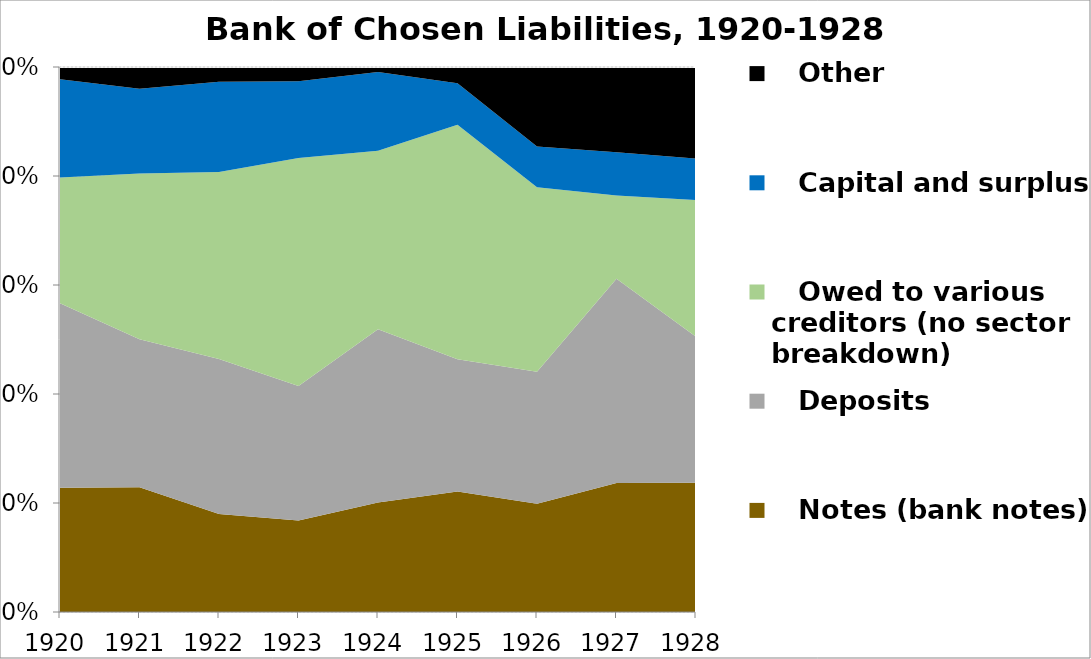
| Category |    Notes (bank notes) |    Deposits |    Owed to various creditors (no sector breakdown) |    Capital and surplus |    Other |
|---|---|---|---|---|---|
| 1920.0 | 115612165 | 171734853 | 116905742 | 91279018 | 11506372 |
| 1921.0 | 137611559 | 162947962 | 182703163 | 93553252 | 23885809 |
| 1922.0 | 101658245 | 160557157 | 193971273 | 93575055 | 15239740 |
| 1923.0 | 110750511 | 163149391 | 276108561 | 92834530 | 17364085 |
| 1924.0 | 129564325 | 204623572 | 211027225 | 93181661 | 5828740 |
| 1925.0 | 120898098 | 132736546 | 235456751 | 41627336 | 16289780 |
| 1926.0 | 111278652 | 135870754 | 189816655 | 41781950 | 81763078 |
| 1927.0 | 124863873 | 197712705 | 80353829 | 42015048 | 82450491 |
| 1928.0 | 132778502 | 149919045 | 140496963 | 42548679 | 94196032 |